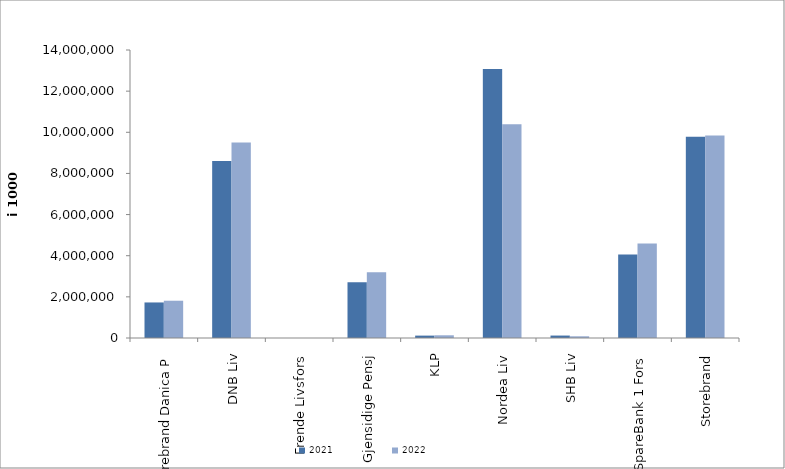
| Category | 2021 | 2022 |
|---|---|---|
| Storebrand Danica P | 1727762.467 | 1811787.29 |
| DNB Liv | 8603889.431 | 9504232 |
| Frende Livsfors | 0 | 0 |
| Gjensidige Pensj | 2707157.76 | 3199959 |
| KLP | 116273.039 | 131709.472 |
| Nordea Liv | 13080796.694 | 10389567.608 |
| SHB Liv | 118580.722 | 82933.02 |
| SpareBank 1 Fors | 4053690.988 | 4592774.789 |
| Storebrand | 9785506.849 | 9839028.086 |